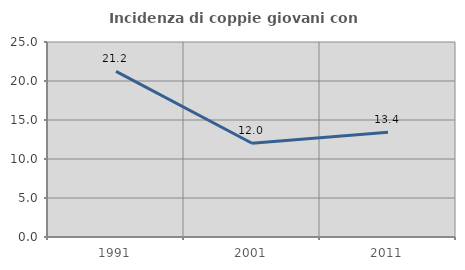
| Category | Incidenza di coppie giovani con figli |
|---|---|
| 1991.0 | 21.244 |
| 2001.0 | 12.019 |
| 2011.0 | 13.433 |